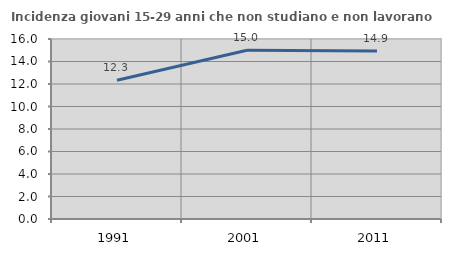
| Category | Incidenza giovani 15-29 anni che non studiano e non lavorano  |
|---|---|
| 1991.0 | 12.333 |
| 2001.0 | 15 |
| 2011.0 | 14.938 |